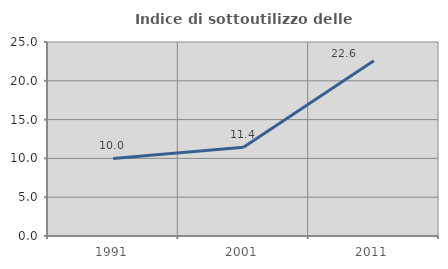
| Category | Indice di sottoutilizzo delle abitazioni  |
|---|---|
| 1991.0 | 10 |
| 2001.0 | 11.429 |
| 2011.0 | 22.581 |